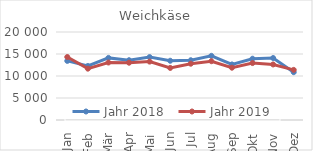
| Category | Jahr 2018 | Jahr 2019 |
|---|---|---|
| Jan | 13434.399 | 14316.514 |
| Feb | 12274.769 | 11666.821 |
| Mär | 14115.886 | 13067.466 |
| Apr | 13586.875 | 13020.785 |
| Mai | 14297.33 | 13273.747 |
| Jun | 13463.146 | 11832.941 |
| Jul | 13580.147 | 12793.557 |
| Aug | 14584.413 | 13361.077 |
| Sep | 12626.046 | 11884.228 |
| Okt | 13931.081 | 12938.939 |
| Nov | 14086.695 | 12624.278 |
| Dez | 10862.644 | 11390.115 |